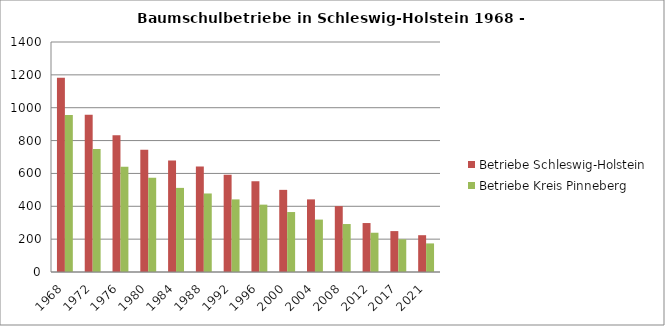
| Category | Betriebe Schleswig-Holstein | Betriebe Kreis Pinneberg |
|---|---|---|
| 1968.0 | 1183 | 956 |
| 1972.0 | 957 | 748 |
| 1976.0 | 832 | 641 |
| 1980.0 | 744 | 574 |
| 1984.0 | 678 | 512 |
| 1988.0 | 642 | 478 |
| 1992.0 | 592 | 442 |
| 1996.0 | 553 | 410 |
| 2000.0 | 500 | 365 |
| 2004.0 | 442 | 319 |
| 2008.0 | 401 | 292 |
| 2012.0 | 298 | 239 |
| 2017.0 | 249 | 199 |
| 2021.0 | 224 | 174 |